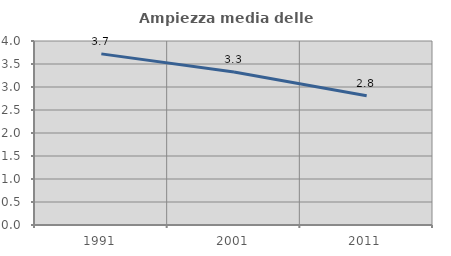
| Category | Ampiezza media delle famiglie |
|---|---|
| 1991.0 | 3.72 |
| 2001.0 | 3.324 |
| 2011.0 | 2.812 |